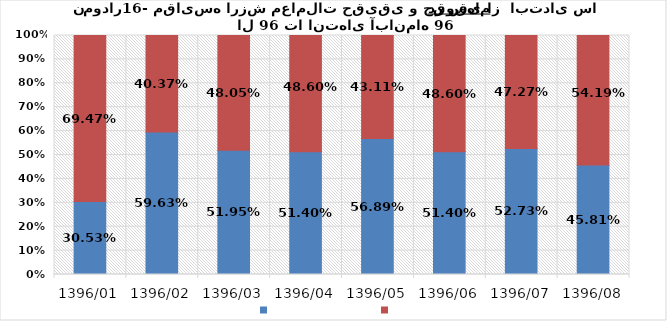
| Category | Series 0 | Series 1 |
|---|---|---|
| 1396/01 | 0.305 | 0.695 |
| 1396/02 | 0.596 | 0.404 |
| 1396/03 | 0.52 | 0.48 |
| 1396/04 | 0.514 | 0.486 |
| 1396/05 | 0.569 | 0.431 |
| 1396/06 | 0.514 | 0.486 |
| 1396/07 | 0.527 | 0.473 |
| 1396/08 | 0.458 | 0.542 |